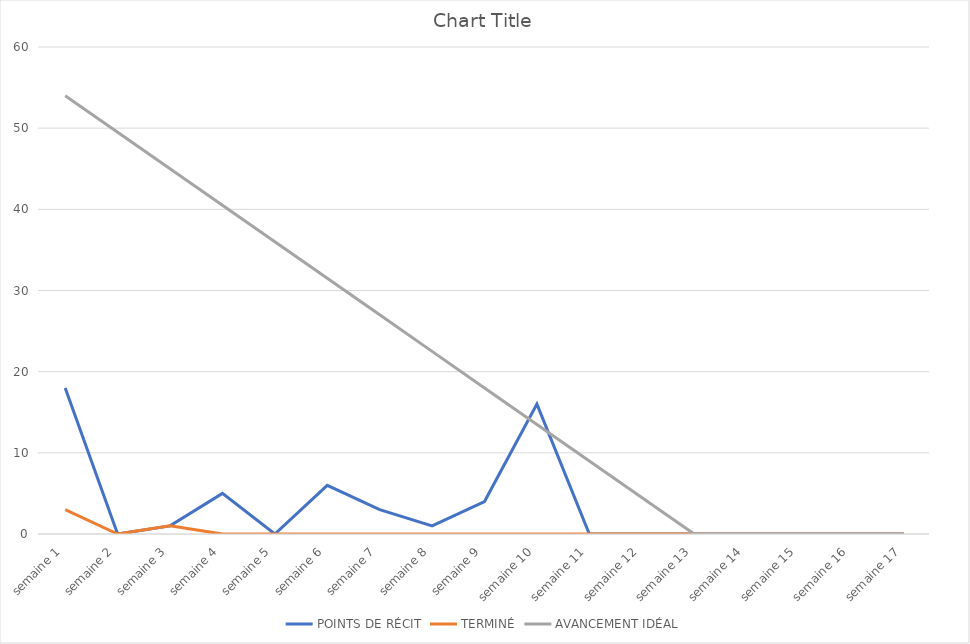
| Category | POINTS DE RÉCIT | TERMINÉ | AVANCEMENT IDÉAL |
|---|---|---|---|
| semaine 1 | 18 | 3 | 54 |
| semaine 2 | 0 | 0 | 49.5 |
| semaine 3 | 1 | 1 | 45 |
| semaine 4 | 5 | 0 | 40.5 |
| semaine 5 | 0 | 0 | 36 |
| semaine 6 | 6 | 0 | 31.5 |
| semaine 7 | 3 | 0 | 27 |
| semaine 8 | 1 | 0 | 22.5 |
| semaine 9 | 4 | 0 | 18 |
| semaine 10 | 16 | 0 | 13.5 |
| semaine 11 | 0 | 0 | 9 |
| semaine 12 | 0 | 0 | 4.5 |
| semaine 13 | 0 | 0 | 0 |
| semaine 14 | 0 | 0 | 0 |
| semaine 15 | 0 | 0 | 0 |
| semaine 16 | 0 | 0 | 0 |
| semaine 17 | 0 | 0 | 0 |